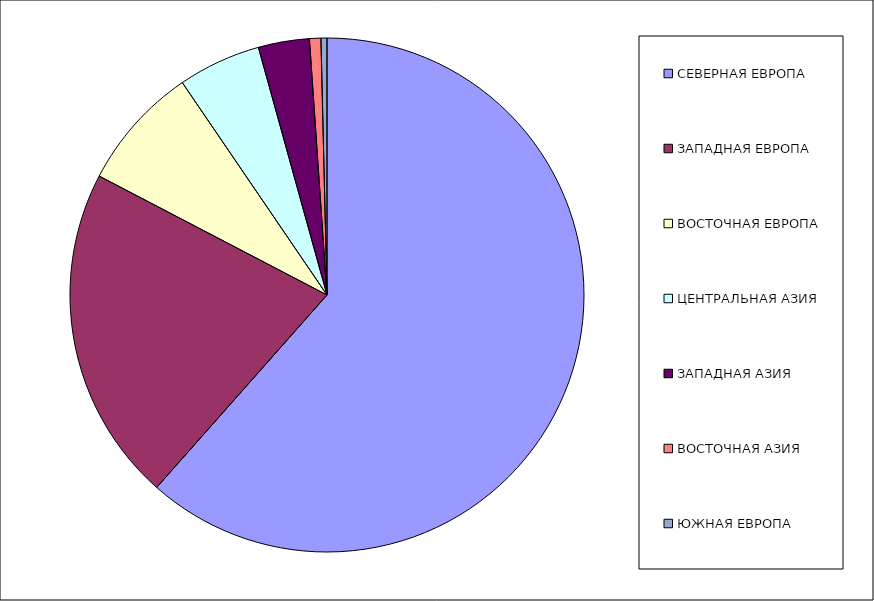
| Category | Оборот |
|---|---|
| СЕВЕРНАЯ ЕВРОПА | 61.529 |
| ЗАПАДНАЯ ЕВРОПА | 21.127 |
| ВОСТОЧНАЯ ЕВРОПА | 7.823 |
| ЦЕНТРАЛЬНАЯ АЗИЯ | 5.219 |
| ЗАПАДНАЯ АЗИЯ | 3.21 |
| ВОСТОЧНАЯ АЗИЯ | 0.715 |
| ЮЖНАЯ ЕВРОПА | 0.376 |